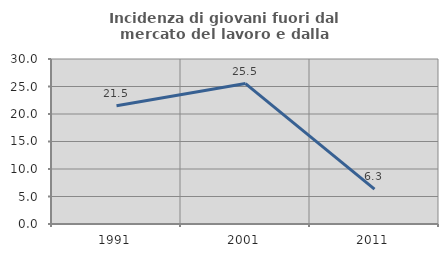
| Category | Incidenza di giovani fuori dal mercato del lavoro e dalla formazione  |
|---|---|
| 1991.0 | 21.488 |
| 2001.0 | 25.532 |
| 2011.0 | 6.329 |